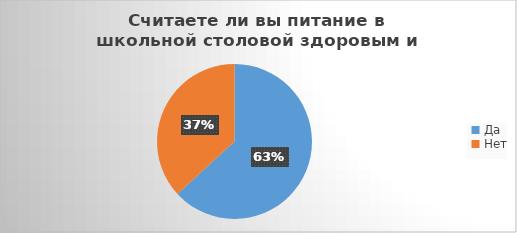
| Category | Series 0 |
|---|---|
| Да | 132 |
| Нет | 77 |